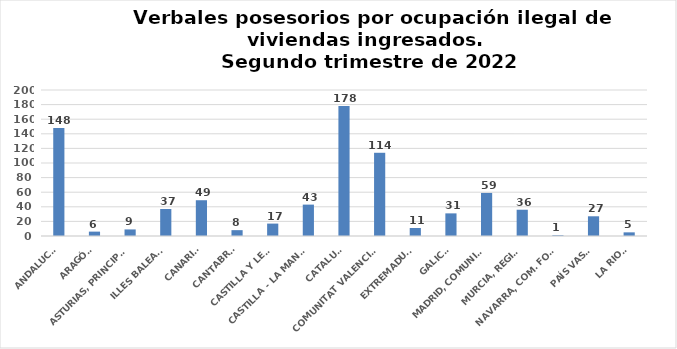
| Category | Series 0 |
|---|---|
| ANDALUCÍA | 148 |
| ARAGÓN | 6 |
| ASTURIAS, PRINCIPADO | 9 |
| ILLES BALEARS | 37 |
| CANARIAS | 49 |
| CANTABRIA | 8 |
| CASTILLA Y LEÓN | 17 |
| CASTILLA - LA MANCHA | 43 |
| CATALUÑA | 178 |
| COMUNITAT VALENCIANA | 114 |
| EXTREMADURA | 11 |
| GALICIA | 31 |
| MADRID, COMUNIDAD | 59 |
| MURCIA, REGIÓN | 36 |
| NAVARRA, COM. FORAL | 1 |
| PAÍS VASCO | 27 |
| LA RIOJA | 5 |